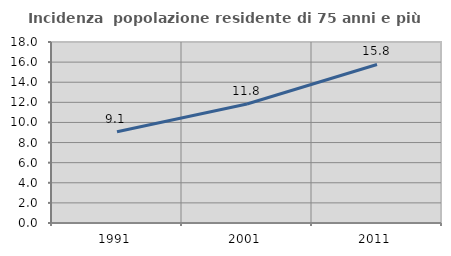
| Category | Incidenza  popolazione residente di 75 anni e più |
|---|---|
| 1991.0 | 9.072 |
| 2001.0 | 11.838 |
| 2011.0 | 15.765 |